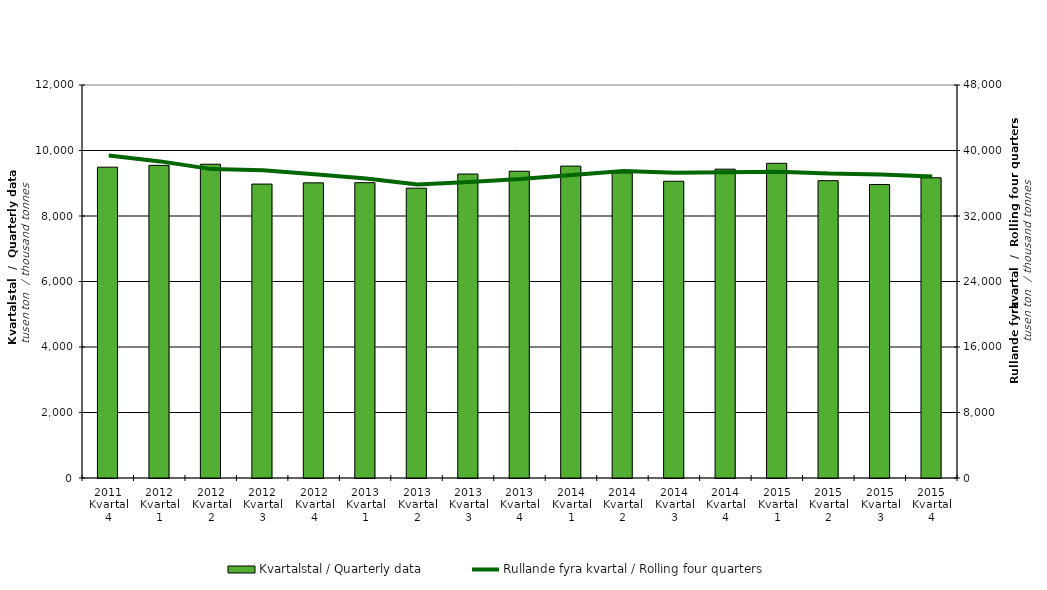
| Category | Kvartalstal / Quarterly data |
|---|---|
| 2011 Kvartal 4 | 9490.486 |
| 2012 Kvartal 1 | 9546.152 |
| 2012 Kvartal 2 | 9580.194 |
| 2012 Kvartal 3 | 8974.501 |
| 2012 Kvartal 4 | 9012.201 |
| 2013 Kvartal 1 | 9017.274 |
| 2013 Kvartal 2 | 8848.116 |
| 2013 Kvartal 3 | 9281.962 |
| 2013 Kvartal 4 | 9366.582 |
| 2014 Kvartal 1 | 9522.959 |
| 2014 Kvartal 2 | 9317.252 |
| 2014 Kvartal 3 | 9061.085 |
| 2014 Kvartal 4 | 9429.997 |
| 2015 Kvartal 1 | 9609.146 |
| 2015 Kvartal 2 | 9078.282 |
| 2015 Kvartal 3 | 8961.37 |
| 2015 Kvartal 4 | 9167.715 |